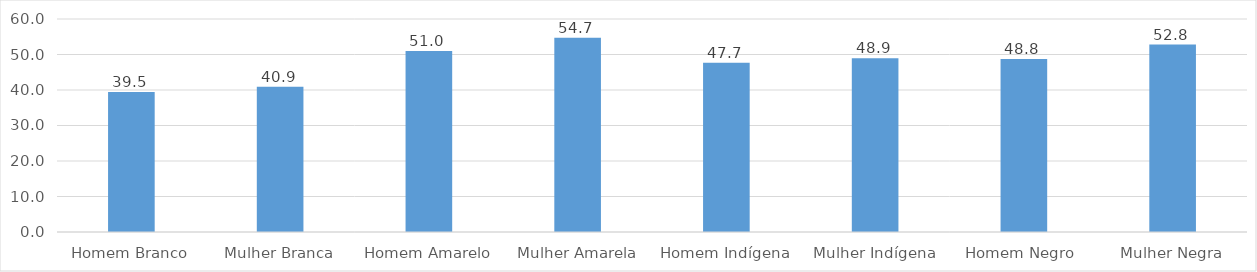
| Category | Series 0 |
|---|---|
| Homem Branco | 39.471 |
| Mulher Branca | 40.911 |
| Homem Amarelo | 50.977 |
| Mulher Amarela | 54.688 |
| Homem Indígena | 47.697 |
| Mulher Indígena | 48.94 |
| Homem Negro  | 48.757 |
| Mulher Negra | 52.788 |